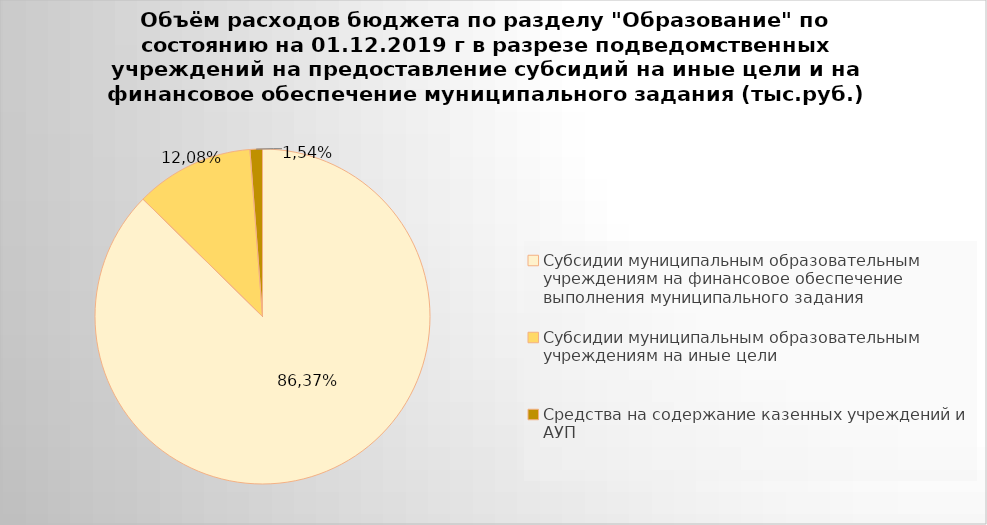
| Category | Series 0 |
|---|---|
| Субсидии муниципальным образовательным учреждениям на финансовое обеспечение выполнения муниципального задания | 5174303.22 |
| Субсидии муниципальным образовательным учреждениям на иные цели | 678057.41 |
| Средства на содержание казенных учреждений и АУП | 71011.12 |